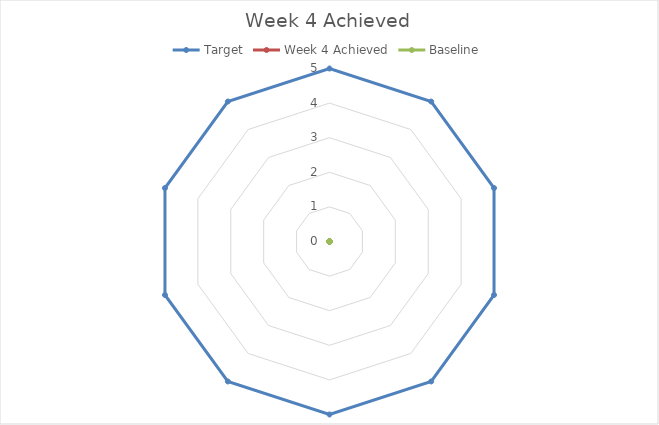
| Category | Target | Week 4 Achieved | Baseline |
|---|---|---|---|
|  | 5 |  |  |
|  | 5 |  |  |
|  | 5 |  |  |
|  | 5 |  |  |
|  | 5 |  |  |
|  | 5 |  |  |
|  | 5 |  |  |
|  | 5 |  |  |
|  | 5 |  |  |
|  | 5 |  |  |